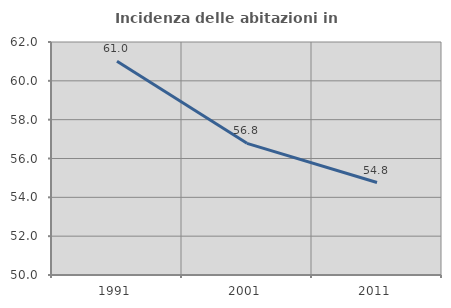
| Category | Incidenza delle abitazioni in proprietà  |
|---|---|
| 1991.0 | 61.01 |
| 2001.0 | 56.782 |
| 2011.0 | 54.764 |